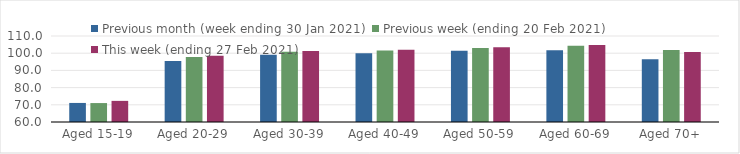
| Category | Previous month (week ending 30 Jan 2021) | Previous week (ending 20 Feb 2021) | This week (ending 27 Feb 2021) |
|---|---|---|---|
| Aged 15-19 | 71.08 | 71.01 | 72.28 |
| Aged 20-29 | 95.44 | 97.84 | 98.45 |
| Aged 30-39 | 99.16 | 100.89 | 101.21 |
| Aged 40-49 | 100.04 | 101.59 | 101.96 |
| Aged 50-59 | 101.36 | 102.97 | 103.39 |
| Aged 60-69 | 101.68 | 104.29 | 104.79 |
| Aged 70+ | 96.49 | 101.84 | 100.64 |